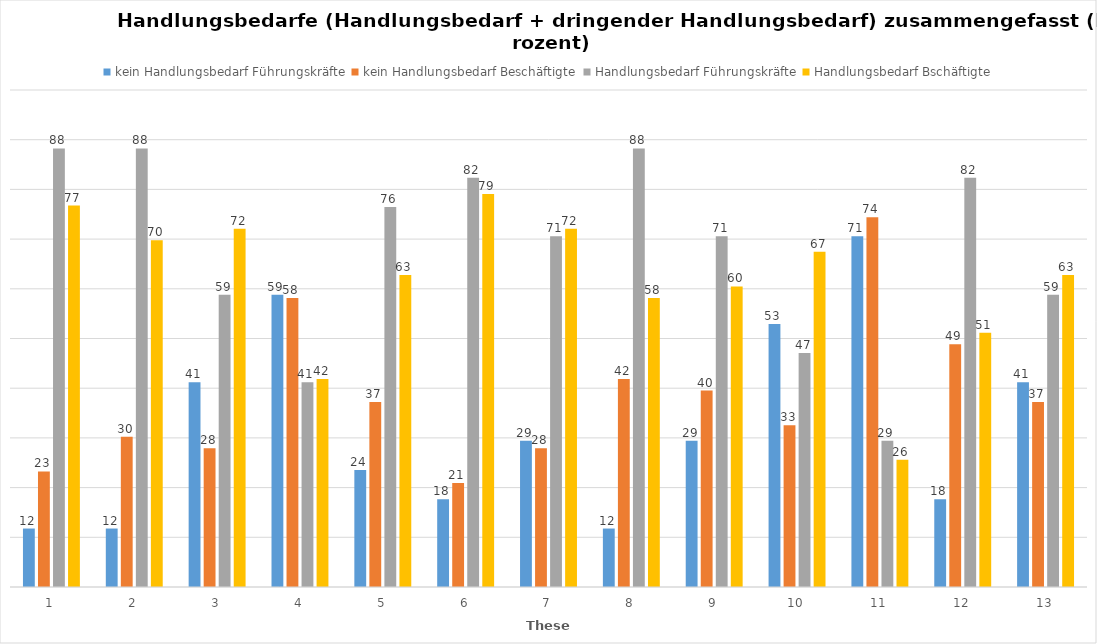
| Category | kein Handlungsbedarf Führungskräfte | kein Handlungsbedarf Beschäftigte | Handlungsbedarf Führungskräfte | Handlungsbedarf Bschäftigte |
|---|---|---|---|---|
| 1.0 | 11.765 | 23.256 | 88.235 | 76.744 |
| 2.0 | 11.765 | 30.233 | 88.235 | 69.767 |
| 3.0 | 41.176 | 27.907 | 58.824 | 72.093 |
| 4.0 | 58.824 | 58.14 | 41.176 | 41.86 |
| 5.0 | 23.529 | 37.209 | 76.471 | 62.791 |
| 6.0 | 17.647 | 20.93 | 82.353 | 79.07 |
| 7.0 | 29.412 | 27.907 | 70.588 | 72.093 |
| 8.0 | 11.765 | 41.86 | 88.235 | 58.14 |
| 9.0 | 29.412 | 39.535 | 70.588 | 60.465 |
| 10.0 | 52.941 | 32.558 | 47.059 | 67.442 |
| 11.0 | 70.588 | 74.419 | 29.412 | 25.581 |
| 12.0 | 17.647 | 48.837 | 82.353 | 51.163 |
| 13.0 | 41.176 | 37.209 | 58.824 | 62.791 |